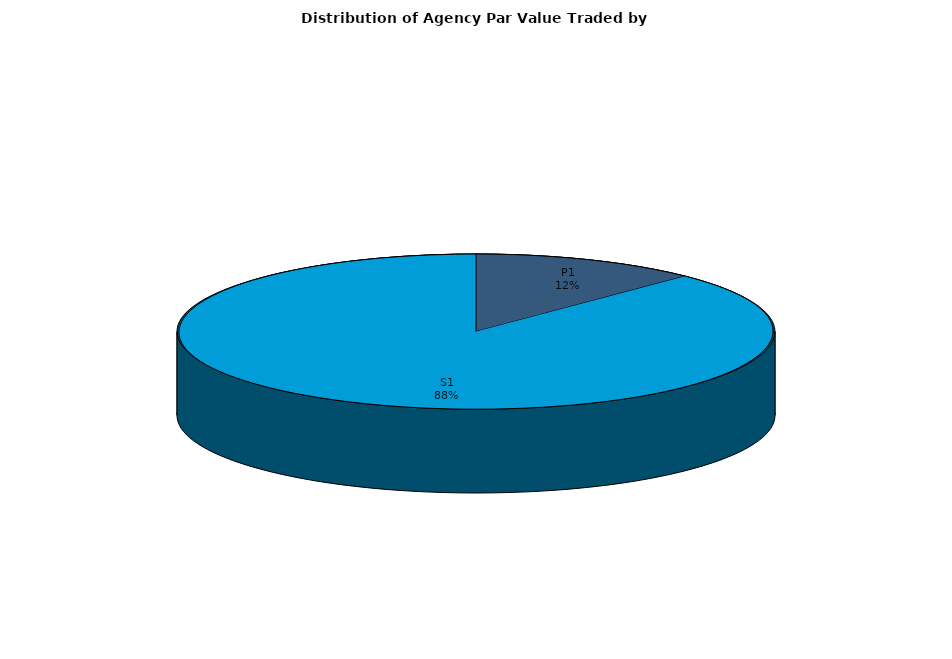
| Category | Series 0 |
|---|---|
| P1 | 738036646.825 |
| S1 | 5249141697.665 |